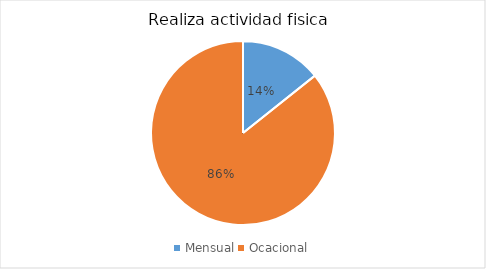
| Category | Series 0 |
|---|---|
| Mensual | 1 |
| Ocacional | 6 |